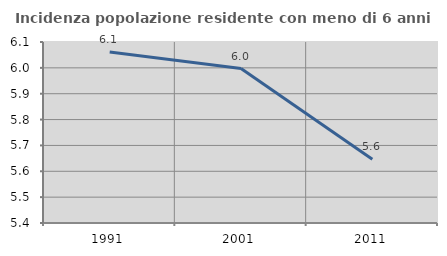
| Category | Incidenza popolazione residente con meno di 6 anni |
|---|---|
| 1991.0 | 6.062 |
| 2001.0 | 5.997 |
| 2011.0 | 5.647 |